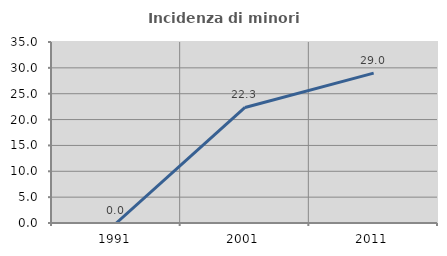
| Category | Incidenza di minori stranieri |
|---|---|
| 1991.0 | 0 |
| 2001.0 | 22.34 |
| 2011.0 | 28.979 |